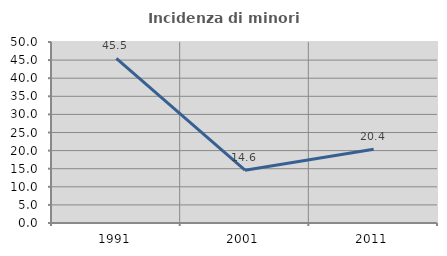
| Category | Incidenza di minori stranieri |
|---|---|
| 1991.0 | 45.455 |
| 2001.0 | 14.583 |
| 2011.0 | 20.354 |